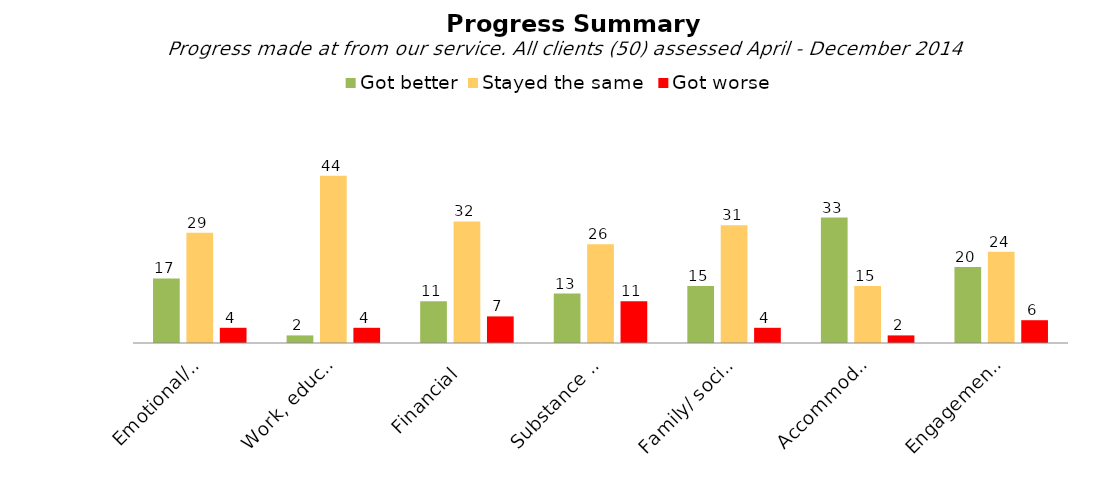
| Category | Got better | Stayed the same  | Got worse |
|---|---|---|---|
| Emotional/mental health  | 17 | 29 | 4 |
| Work, education and training | 2 | 44 | 4 |
| Financial  | 11 | 32 | 7 |
| Substance misuse | 13 | 26 | 11 |
| Family/ social relationships  | 15 | 31 | 4 |
| Accommodation | 33 | 15 | 2 |
| Engagement with services | 20 | 24 | 6 |